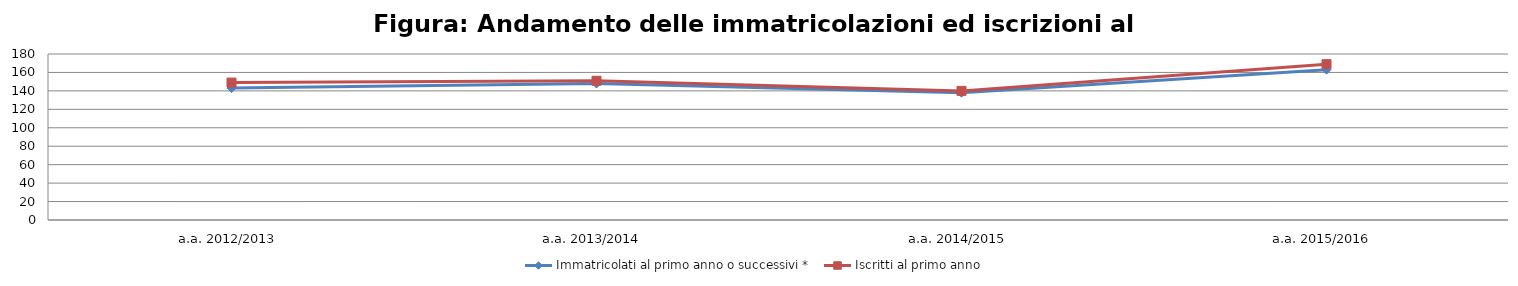
| Category | Immatricolati al primo anno o successivi * | Iscritti al primo anno  |
|---|---|---|
| a.a. 2012/2013 | 143 | 149 |
| a.a. 2013/2014 | 148 | 151 |
| a.a. 2014/2015 | 138 | 140 |
| a.a. 2015/2016 | 163 | 169 |